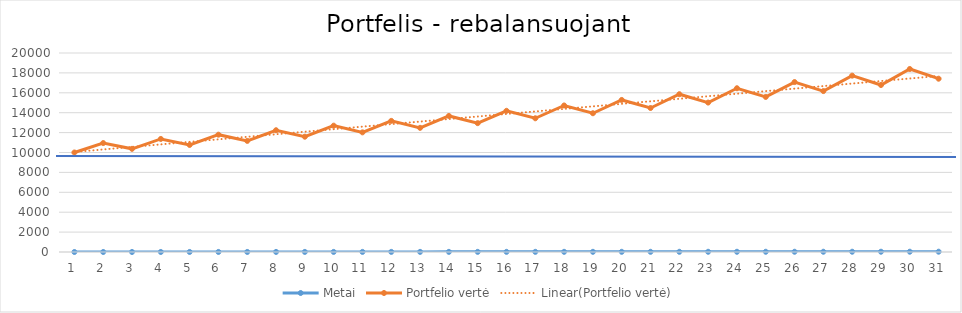
| Category | Metai | Portfelio vertė |
|---|---|---|
| 0 | 0 | 10000 |
| 1 | 1 | 10948.959 |
| 2 | 2 | 10368.711 |
| 3 | 3 | 11362.195 |
| 4 | 4 | 10760.048 |
| 5 | 5 | 11791.028 |
| 6 | 6 | 11166.154 |
| 7 | 7 | 12236.046 |
| 8 | 8 | 11587.588 |
| 9 | 9 | 12697.86 |
| 10 | 10 | 12024.928 |
| 11 | 11 | 13177.103 |
| 12 | 12 | 12478.774 |
| 13 | 13 | 13674.435 |
| 14 | 14 | 12949.748 |
| 15 | 15 | 14190.536 |
| 16 | 16 | 13438.499 |
| 17 | 17 | 14726.117 |
| 18 | 18 | 13945.696 |
| 19 | 19 | 15281.911 |
| 20 | 20 | 14472.035 |
| 21 | 21 | 15858.682 |
| 22 | 22 | 15018.24 |
| 23 | 23 | 16457.221 |
| 24 | 24 | 15585.06 |
| 25 | 25 | 17078.351 |
| 26 | 26 | 16173.272 |
| 27 | 27 | 17722.924 |
| 28 | 28 | 16783.685 |
| 29 | 29 | 18391.824 |
| 30 | 30 | 17417.136 |